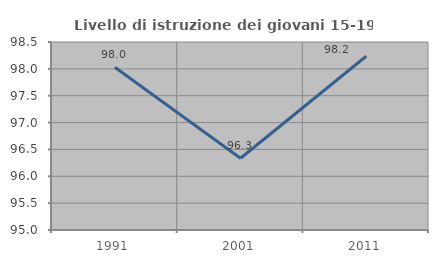
| Category | Livello di istruzione dei giovani 15-19 anni |
|---|---|
| 1991.0 | 98.03 |
| 2001.0 | 96.335 |
| 2011.0 | 98.235 |